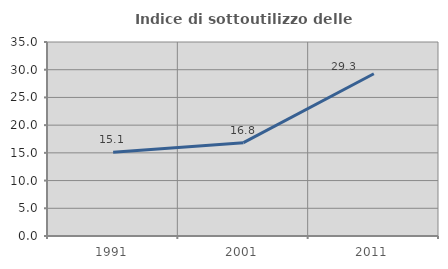
| Category | Indice di sottoutilizzo delle abitazioni  |
|---|---|
| 1991.0 | 15.107 |
| 2001.0 | 16.845 |
| 2011.0 | 29.264 |